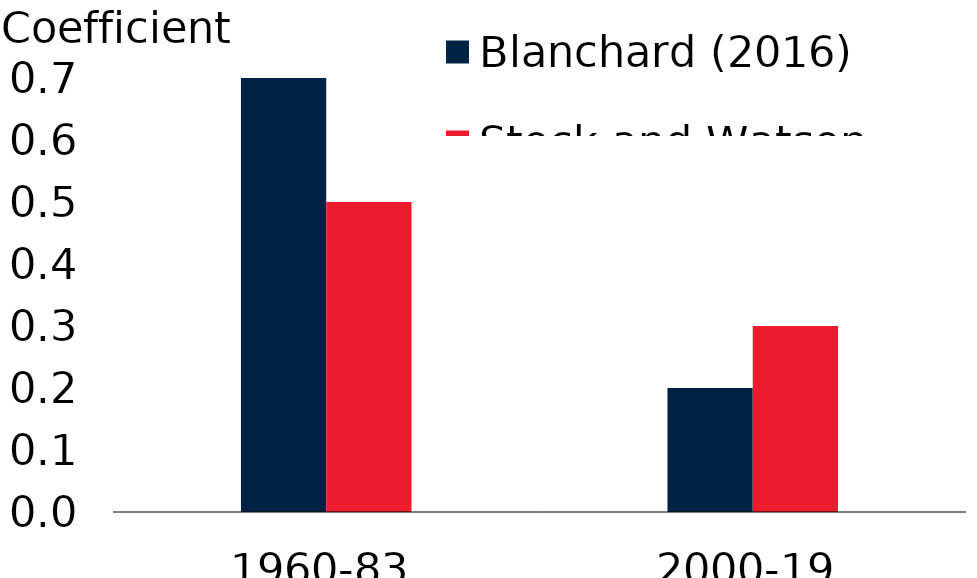
| Category | Blanchard (2016) | Stock and Watson (2019) |
|---|---|---|
| 1960-83 | 0.7 | 0.5 |
| 2000-19 | 0.2 | 0.3 |